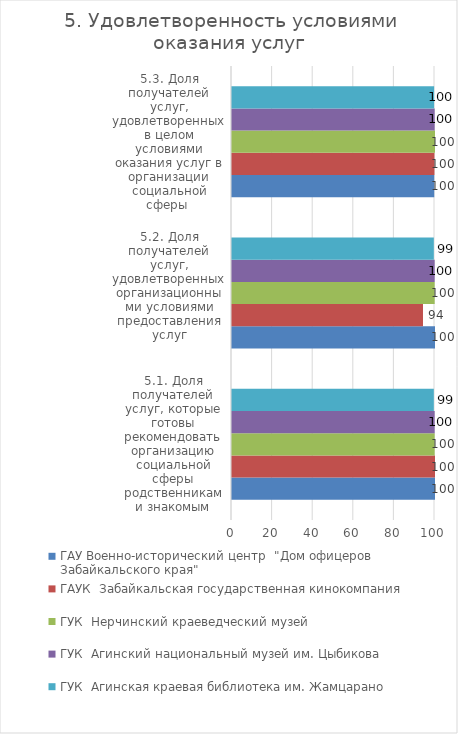
| Category | ГАУ Военно-исторический центр  "Дом офицеров Забайкальского края"  | ГАУК  Забайкальская государственная кинокомпания  | ГУК  Нерчинский краеведческий музей  | ГУК  Агинский национальный музей им. Цыбикова  | ГУК  Агинская краевая библиотека им. Жамцарано  |
|---|---|---|---|---|---|
| 5.1. Доля получателей услуг, которые готовы рекомендовать организацию социальной сферы родственникам и знакомым | 100 | 100 | 99.842 | 99.843 | 99.424 |
| 5.2. Доля получателей услуг, удовлетворенных организационными условиями предоставления услуг | 100 | 94.086 | 99.842 | 99.843 | 99.424 |
| 5.3. Доля получателей услуг, удовлетворенных в целом условиями оказания услуг в организации социальной сферы  | 99.626 | 99.731 | 100 | 99.843 | 99.568 |